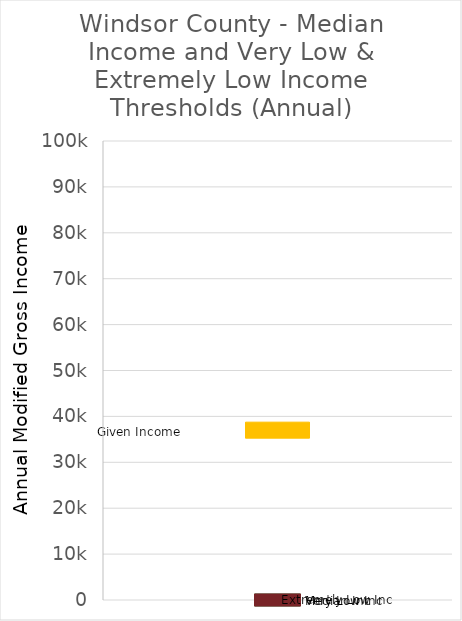
| Category | header |
|---|---|
| 1.0 | 0 |
| 1.0 | 0 |
| 1.0 | 0 |
| 1.0 | 37000 |